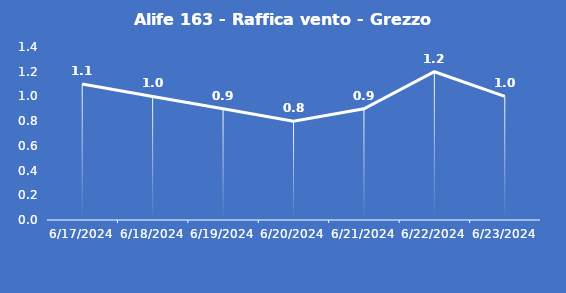
| Category | Alife 163 - Raffica vento - Grezzo (m/s) |
|---|---|
| 6/17/24 | 1.1 |
| 6/18/24 | 1 |
| 6/19/24 | 0.9 |
| 6/20/24 | 0.8 |
| 6/21/24 | 0.9 |
| 6/22/24 | 1.2 |
| 6/23/24 | 1 |